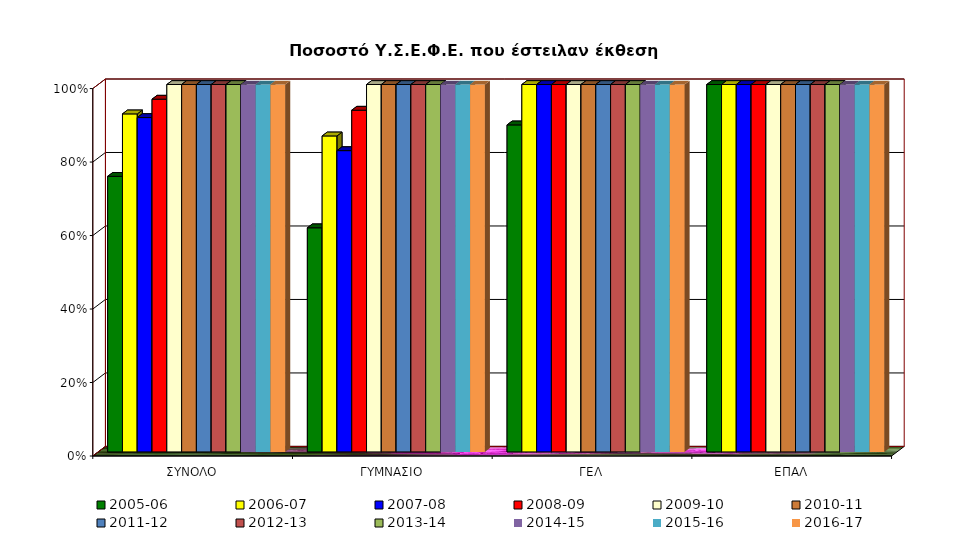
| Category | 2005-06 | 2006-07 | 2007-08 | 2008-09 | 2009-10 | 2010-11 | 2011-12 | 2012-13 | 2013-14 | 2014-15 | 2015-16 | 2016-17 |
|---|---|---|---|---|---|---|---|---|---|---|---|---|
| ΣΥΝΟΛΟ | 0.75 | 0.92 | 0.91 | 0.96 | 1 | 1 | 1 | 1 | 1 | 1 | 1 | 1 |
| ΓΥΜΝΑΣΙΟ | 0.61 | 0.86 | 0.82 | 0.93 | 1 | 1 | 1 | 1 | 1 | 1 | 1 | 1 |
| ΓΕΛ | 0.89 | 1 | 1 | 1 | 1 | 1 | 1 | 1 | 1 | 1 | 1 | 1 |
| ΕΠΑΛ | 1 | 1 | 1 | 1 | 1 | 1 | 1 | 1 | 1 | 1 | 1 | 1 |